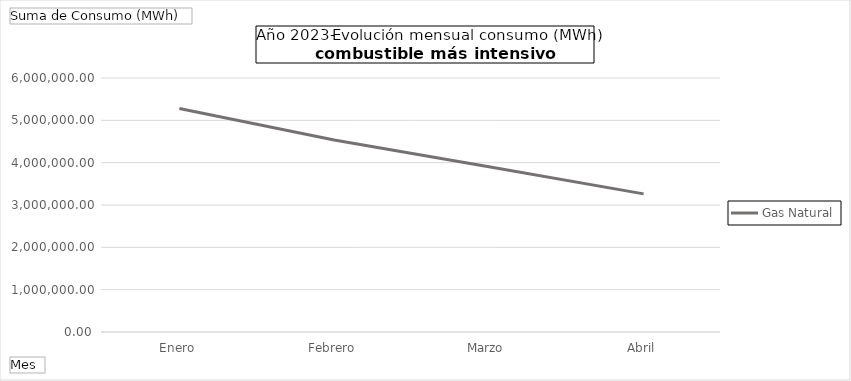
| Category | Gas Natural |
|---|---|
| Enero | 5278042.43 |
| Febrero | 4535353.05 |
| Marzo | 3905406.38 |
| Abril | 3262656.65 |